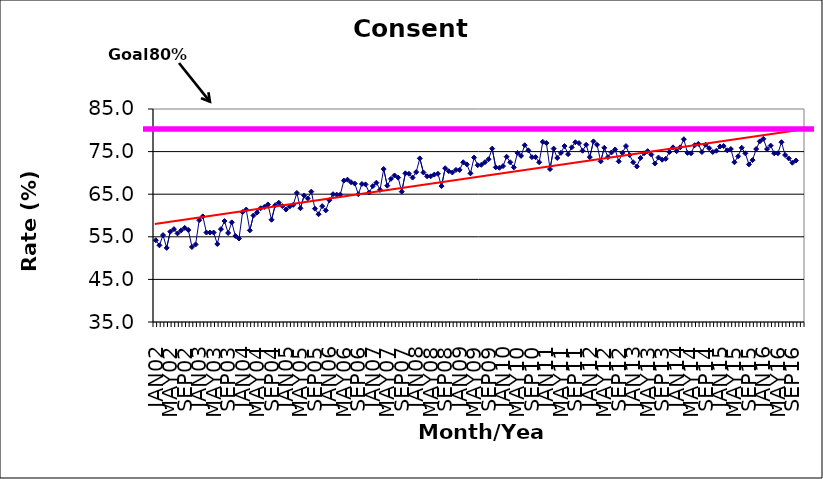
| Category | Series 0 |
|---|---|
| JAN02 | 54.2 |
| FEB02 | 53 |
| MAR02 | 55.4 |
| APR02 | 52.4 |
| MAY02 | 56.2 |
| JUN02 | 56.8 |
| JUL02 | 55.8 |
| AUG02 | 56.5 |
| SEP02 | 57.1 |
| OCT02 | 56.6 |
| NOV02 | 52.6 |
| DEC02 | 53.2 |
| JAN03 | 58.9 |
| FEB03 | 59.8 |
| MAR03 | 56 |
| APR03 | 56 |
| MAY03 | 56 |
| JUN03 | 53.3 |
| JUL03 | 56.8 |
| AUG03 | 58.7 |
| SEP03 | 55.9 |
| OCT03 | 58.4 |
| NOV03 | 55.2 |
| DEC03 | 54.6 |
| JAN04 | 60.8 |
| FEB04 | 61.4 |
| MAR04 | 56.5 |
| APR04 | 60 |
| MAY04 | 60.7 |
| JUN04 | 61.7 |
| JUL04 | 62 |
| AUG04 | 62.6 |
| SEP04 | 59 |
| OCT04 | 62.4 |
| NOV04 | 63 |
| DEC04 | 62.2 |
| JAN05 | 61.4 |
| FEB05 | 62.1 |
| MAR05 | 62.5 |
| APR05 | 65.3 |
| MAY05 | 61.7 |
| JUN05 | 64.7 |
| JUL05 | 64 |
| AUG05 | 65.6 |
| SEP05 | 61.6 |
| OCT05 | 60.3 |
| NOV05 | 62.2 |
| DEC05 | 61.2 |
| JAN06 | 63.6 |
| FEB06 | 65 |
| MAR06 | 64.9 |
| APR06 | 64.9 |
| MAY06 | 68.2 |
| JUN06 | 68.4 |
| JUL06 | 67.8 |
| AUG06 | 67.5 |
| SEP06 | 65 |
| OCT06 | 67.4 |
| NOV06 | 67.3 |
| DEC06 | 65.4 |
| JAN07 | 66.9 |
| FEB07 | 67.7 |
| MAR07 | 66 |
| APR07 | 70.9 |
| MAY07 | 67 |
| JUN07 | 68.6 |
| JUL07 | 69.4 |
| AUG07 | 68.9 |
| SEP07 | 65.6 |
| OCT07 | 69.9 |
| NOV07 | 69.8 |
| DEC07 | 68.9 |
| JAN08 | 70.2 |
| FEB08 | 73.4 |
| MAR08 | 70.1 |
| APR08 | 69.2 |
| MAY08 | 69.2 |
| JUN08 | 69.6 |
| JUL08 | 69.8 |
| AUG08 | 66.9 |
| SEP08 | 71.1 |
| OCT08 | 70.4 |
| NOV08 | 70.1 |
| DEC08 | 70.7 |
| JAN09 | 70.7 |
| FEB09 | 72.5 |
| MAR09 | 72 |
| APR09 | 69.9 |
| MAY09 | 73.6 |
| JUN09 | 71.8 |
| JUL09 | 71.9 |
| AUG09 | 72.5 |
| SEP09 | 73.2 |
| OCT09 | 75.7 |
| NOV09 | 71.3 |
| DEC09 | 71.2 |
| JAN10 | 71.6 |
| FEB10 | 73.8 |
| MAR10 | 72.5 |
| APR10 | 71.3 |
| MAY10 | 74.7 |
| JUN10 | 74 |
| JUL10 | 76.5 |
| AUG10 | 75.3 |
| SEP10 | 73.7 |
| OCT10 | 73.7 |
| NOV10 | 72.5 |
| DEC10 | 77.3 |
| JAN11 | 77 |
| FEB11 | 70.9 |
| MAR11 | 75.7 |
| APR11 | 73.5 |
| MAY11 | 74.7 |
| JUN11 | 76.3 |
| JUL11 | 74.4 |
| AUG11 | 76 |
| SEP11 | 77.2 |
| OCT11 | 77 |
| NOV11 | 75.2 |
| DEC11 | 76.6 |
| JAN12 | 73.7 |
| FEB12 | 77.4 |
| MAR12 | 76.6 |
| APR12 | 72.7 |
| MAY12 | 75.9 |
| JUN12 | 73.7 |
| JUL12 | 74.8 |
| AUG12 | 75.5 |
| SEP12 | 72.7 |
| OCT12 | 74.7 |
| NOV12 | 76.3 |
| DEC12 | 74.2 |
| JAN13 | 72.5 |
| FEB13 | 71.5 |
| MAR13 | 73.5 |
| APR13 | 74.6 |
| MAY13 | 75.1 |
| JUN13 | 74.3 |
| JUL13 | 72.2 |
| AUG13 | 73.6 |
| SEP13 | 73.1 |
| OCT13 | 73.3 |
| NOV13 | 74.9 |
| DEC13 | 76 |
| JAN14 | 75.1 |
| FEB14 | 76 |
| MAR14 | 77.9 |
| APR14 | 74.7 |
| MAY14 | 74.6 |
| JUN14 | 76.5 |
| JUL14 | 76.8 |
| AUG14 | 74.9 |
| SEP14 | 76.6 |
| OCT14 | 75.8 |
| NOV14 | 74.9 |
| DEC14 | 75.2 |
| JAN15 | 76.2 |
| FEB15 | 76.3 |
| MAR15 | 75.3 |
| APR15 | 75.6 |
| MAY15 | 72.5 |
| JUN15 | 73.9 |
| JUL15 | 75.9 |
| AUG15 | 74.6 |
| SEP15 | 72 |
| OCT15 | 73 |
| NOV15 | 75.6 |
| DEC15 | 77.4 |
| JAN16 | 78 |
| FEB16 | 75.6 |
| MAR16 | 76.4 |
| APR16 | 74.6 |
| MAY16 | 74.6 |
| JUN16 | 77.2 |
| JUL16 | 74.2 |
| AUG16 | 73.4 |
| SEP16 | 72.4 |
| OCT16 | 72.9 |